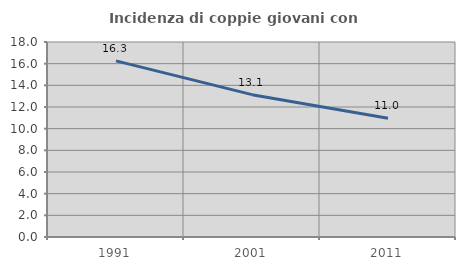
| Category | Incidenza di coppie giovani con figli |
|---|---|
| 1991.0 | 16.258 |
| 2001.0 | 13.139 |
| 2011.0 | 10.967 |